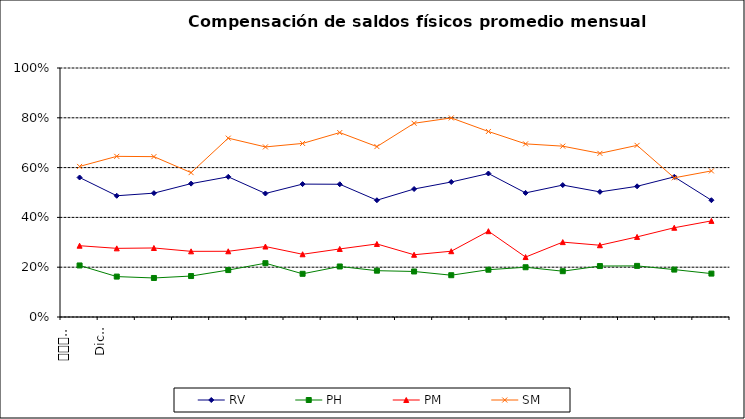
| Category | RV | PH | PM | SM |
|---|---|---|---|---|
| 0 | 0.56 | 0.207 | 0.286 | 0.605 |
| 1 | 0.487 | 0.162 | 0.276 | 0.645 |
| 2 | 0.497 | 0.157 | 0.277 | 0.644 |
| 3 | 0.536 | 0.164 | 0.264 | 0.58 |
| 4 | 0.563 | 0.188 | 0.264 | 0.718 |
| 5 | 0.496 | 0.216 | 0.283 | 0.683 |
| 6 | 0.534 | 0.174 | 0.252 | 0.697 |
| 7 | 0.533 | 0.203 | 0.273 | 0.741 |
| 8 | 0.469 | 0.186 | 0.293 | 0.684 |
| 9 | 0.514 | 0.183 | 0.25 | 0.778 |
| 10 | 0.542 | 0.168 | 0.264 | 0.8 |
| 11 | 0.576 | 0.19 | 0.345 | 0.745 |
| 12 | 0.498 | 0.2 | 0.241 | 0.695 |
| 13 | 0.53 | 0.184 | 0.301 | 0.686 |
| 14 | 0.502 | 0.205 | 0.288 | 0.657 |
| 15 | 0.525 | 0.205 | 0.322 | 0.689 |
| 16 | 0.563 | 0.19 | 0.358 | 0.559 |
| 17 | 0.469 | 0.174 | 0.386 | 0.587 |